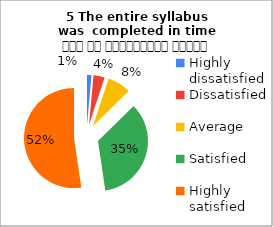
| Category | 5 The entire syllabus was  completed in time समय पर पाठ्यक्रम पूर्ण हुआ |
|---|---|
| Highly dissatisfied | 4 |
| Dissatisfied | 10 |
| Average | 21 |
| Satisfied | 97 |
| Highly satisfied | 145 |